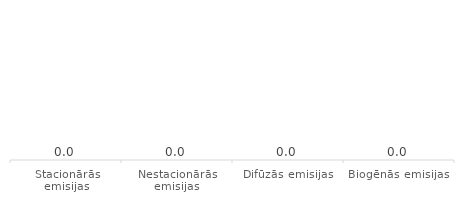
| Category | Series 0 |
|---|---|
| Stacionārās emisijas | 0 |
| Nestacionārās emisijas | 0 |
| Difūzās emisijas | 0 |
| Biogēnās emisijas | 0 |